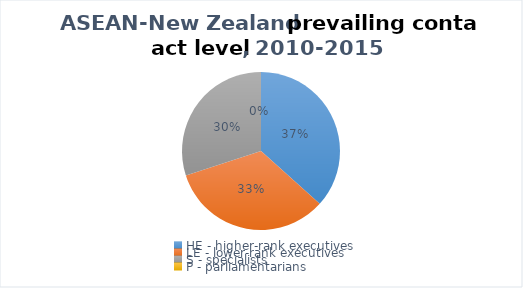
| Category | 2010-2015 |
|---|---|
| HE - higher-rank executives | 11 |
| LE - lower-rank executives | 10 |
| S - specialists | 9 |
| P - parliamentarians | 0 |